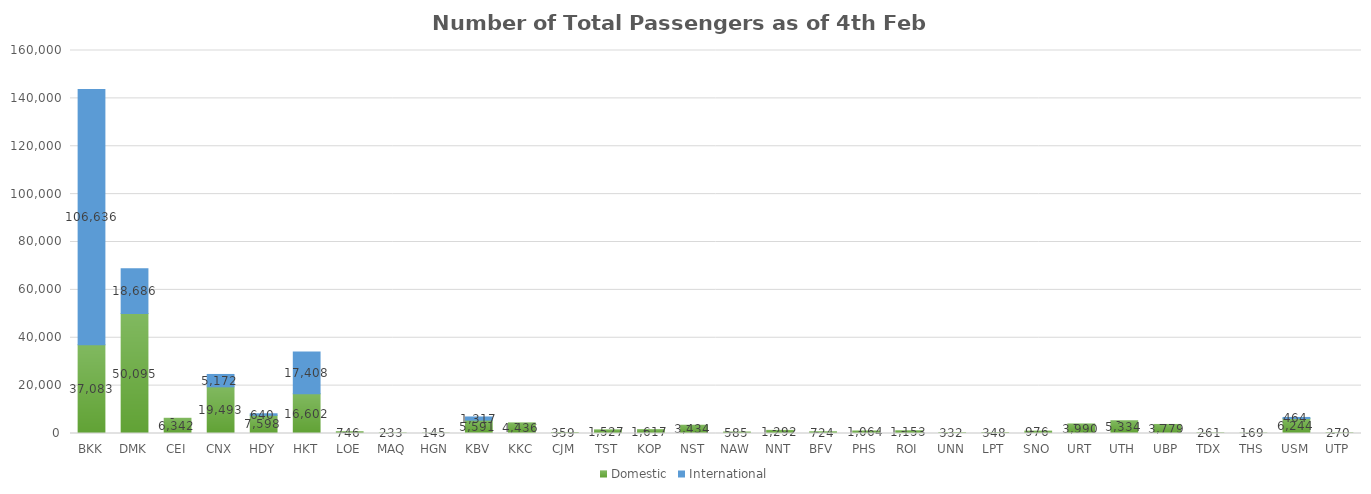
| Category | Domestic | International |
|---|---|---|
| BKK | 37083 | 106636 |
| DMK | 50095 | 18686 |
| CEI | 6342 | 0 |
| CNX | 19493 | 5172 |
| HDY | 7598 | 640 |
| HKT | 16602 | 17408 |
| LOE | 746 | 0 |
| MAQ | 233 | 0 |
| HGN | 145 | 0 |
| KBV | 5591 | 1317 |
| KKC | 4436 | 0 |
| CJM | 359 | 0 |
| TST | 1527 | 0 |
| KOP | 1617 | 0 |
| NST | 3434 | 0 |
| NAW | 585 | 0 |
| NNT | 1292 | 0 |
| BFV | 724 | 0 |
| PHS | 1064 | 0 |
| ROI | 1153 | 0 |
| UNN | 332 | 0 |
| LPT | 348 | 0 |
| SNO | 976 | 0 |
| URT | 3990 | 0 |
| UTH | 5334 | 0 |
| UBP | 3779 | 0 |
| TDX | 261 | 0 |
| THS | 169 | 0 |
| USM | 6244 | 464 |
| UTP | 270 | 0 |